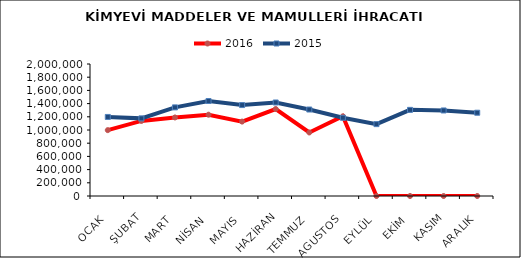
| Category | 2016 | 2015 |
|---|---|---|
| OCAK | 997848.142 | 1197749.137 |
| ŞUBAT | 1137269.733 | 1176291.813 |
| MART | 1189999.803 | 1342695.269 |
| NİSAN | 1231751.245 | 1439379.392 |
| MAYIS | 1127396.481 | 1377751.55 |
| HAZİRAN | 1317779.94 | 1416856.81 |
| TEMMUZ | 962639.414 | 1310336.302 |
| AGUSTOS | 1207352.098 | 1185557.276 |
| EYLÜL | 0 | 1088970.926 |
| EKİM | 0 | 1305062.574 |
| KASIM | 0 | 1295975.01 |
| ARALIK | 0 | 1261682.901 |